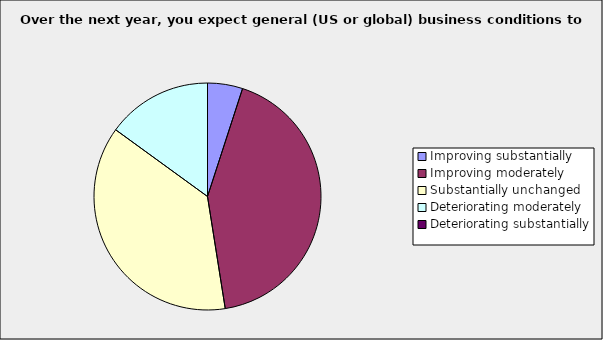
| Category | Series 0 |
|---|---|
| Improving substantially | 0.05 |
| Improving moderately | 0.425 |
| Substantially unchanged | 0.375 |
| Deteriorating moderately | 0.15 |
| Deteriorating substantially | 0 |